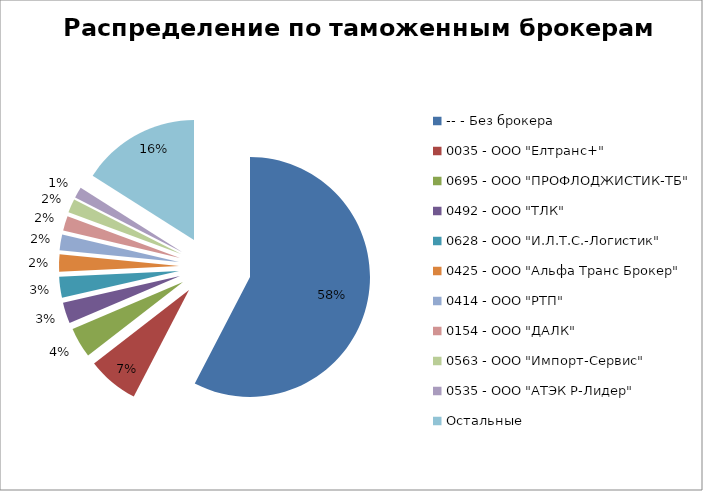
| Category | Стоимость, USD |
|---|---|
| -- - Без брокера | 10867311.83 |
| 0035 - ООО "Елтранс+" | 1304163.85 |
| 0695 - ООО "ПРОФЛОДЖИСТИК-ТБ" | 768313.2 |
| 0492 - ООО "ТЛК" | 533254.19 |
| 0628 - ООО "И.Л.Т.С.-Логистик" | 528283.22 |
| 0425 - ООО "Альфа Транс Брокер" | 442805.01 |
| 0414 - ООО "РТП" | 396420.7 |
| 0154 - ООО "ДАЛК" | 374440 |
| 0563 - ООО "Импорт-Сервис" | 350165.33 |
| 0535 - ООО "АТЭК Р-Лидер" | 279679.59 |
| Остальные | 3018443.26 |